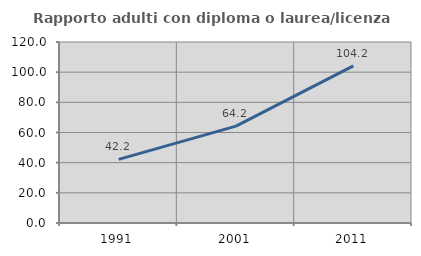
| Category | Rapporto adulti con diploma o laurea/licenza media  |
|---|---|
| 1991.0 | 42.197 |
| 2001.0 | 64.242 |
| 2011.0 | 104.183 |